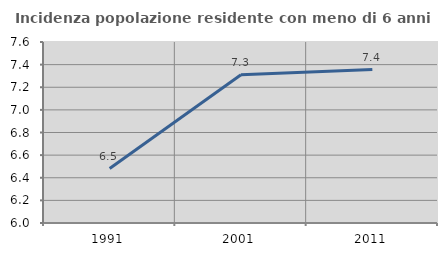
| Category | Incidenza popolazione residente con meno di 6 anni |
|---|---|
| 1991.0 | 6.481 |
| 2001.0 | 7.311 |
| 2011.0 | 7.356 |